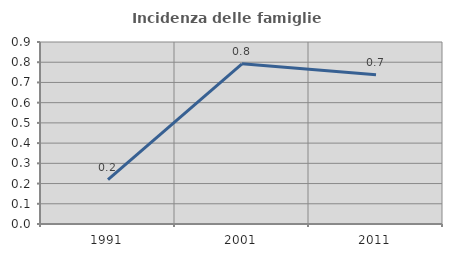
| Category | Incidenza delle famiglie numerose |
|---|---|
| 1991.0 | 0.22 |
| 2001.0 | 0.792 |
| 2011.0 | 0.739 |